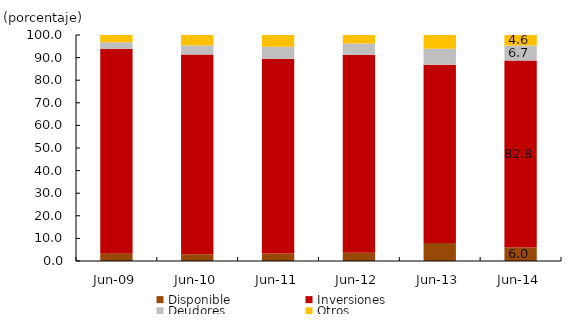
| Category | Disponible | Inversiones | Deudores | Otros |
|---|---|---|---|---|
| 2009-06-01 | 3.206 | 90.757 | 2.845 | 3.192 |
| 2010-06-01 | 2.998 | 88.393 | 3.965 | 4.644 |
| 2011-06-01 | 3.339 | 86.127 | 5.35 | 5.184 |
| 2012-06-01 | 3.678 | 87.611 | 4.965 | 3.745 |
| 2013-06-01 | 7.989 | 78.834 | 7.044 | 6.133 |
| 2014-06-01 | 5.96 | 82.755 | 6.678 | 4.607 |